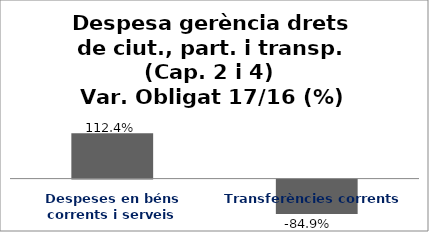
| Category | Series 0 |
|---|---|
| Despeses en béns corrents i serveis | 1.124 |
| Transferències corrents | -0.849 |